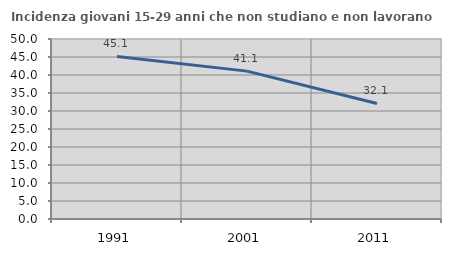
| Category | Incidenza giovani 15-29 anni che non studiano e non lavorano  |
|---|---|
| 1991.0 | 45.145 |
| 2001.0 | 41.077 |
| 2011.0 | 32.092 |